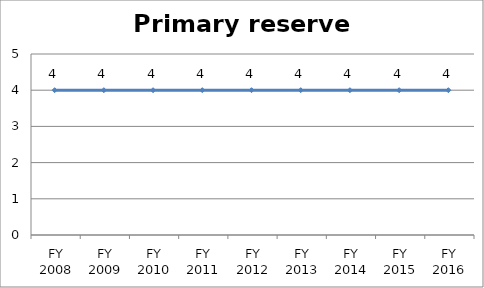
| Category | Primary reserve score |
|---|---|
| FY 2016 | 4 |
| FY 2015 | 4 |
| FY 2014 | 4 |
| FY 2013 | 4 |
| FY 2012 | 4 |
| FY 2011 | 4 |
| FY 2010 | 4 |
| FY 2009 | 4 |
| FY 2008 | 4 |